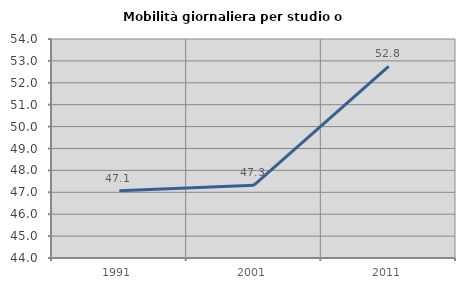
| Category | Mobilità giornaliera per studio o lavoro |
|---|---|
| 1991.0 | 47.074 |
| 2001.0 | 47.322 |
| 2011.0 | 52.755 |